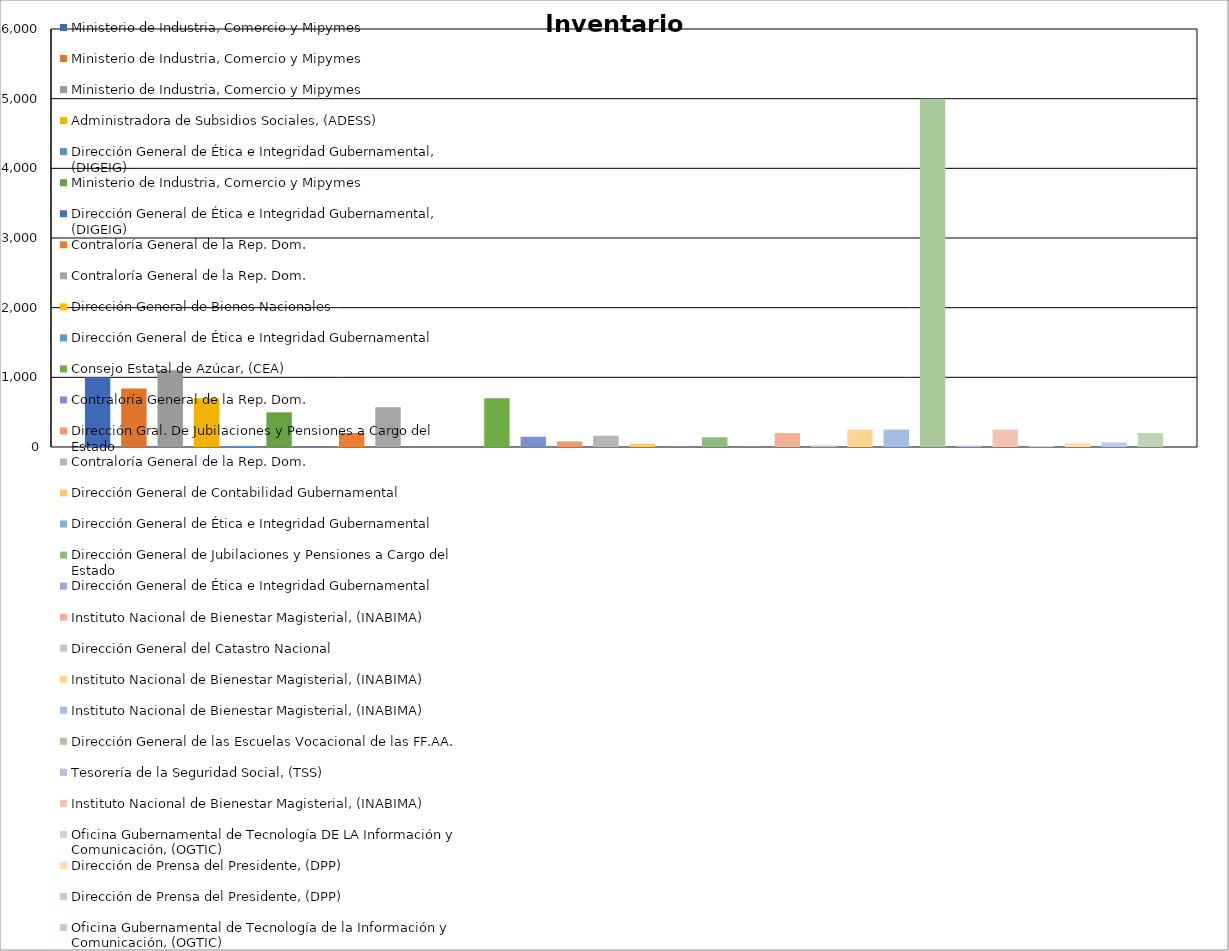
| Category | Ministerio de Industria, Comercio y Mipymes | Administradora de Subsidios Sociales, (ADESS) | Dirección General de Ética e Integridad Gubernamental, (DIGEIG) | Contraloría General de la Rep. Dom. | Dirección General de Bienes Nacionales | Dirección General de Ética e Integridad Gubernamental | Consejo Estatal de Azúcar, (CEA) | Dirección Gral. De Jubilaciones y Pensiones a Cargo del Estado | Dirección General de Contabilidad Gubernamental | Dirección General de Jubilaciones y Pensiones a Cargo del Estado | Instituto Nacional de Bienestar Magisterial, (INABIMA) | Dirección General del Catastro Nacional | Dirección General de las Escuelas Vocacional de las FF.AA. | Tesorería de la Seguridad Social, (TSS) | Oficina Gubernamental de Tecnología DE LA Información y Comunicación, (OGTIC) | Dirección de Prensa del Presidente, (DPP) | Oficina Gubernamental de Tecnología de la Información y Comunicación, (OGTIC) |
|---|---|---|---|---|---|---|---|---|---|---|---|---|---|---|---|---|---|
| 0 | 498 | 700 | 5 | 162 | 1 | 5 | 700 | 80 | 49 | 140 | 249 | 20 | 5000 | 19 | 14 | 66 | 200 |